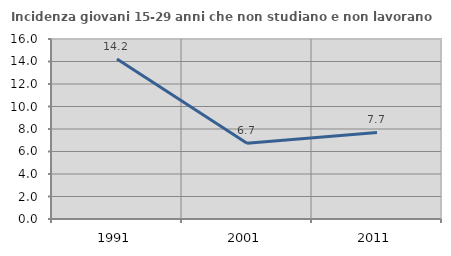
| Category | Incidenza giovani 15-29 anni che non studiano e non lavorano  |
|---|---|
| 1991.0 | 14.213 |
| 2001.0 | 6.731 |
| 2011.0 | 7.692 |